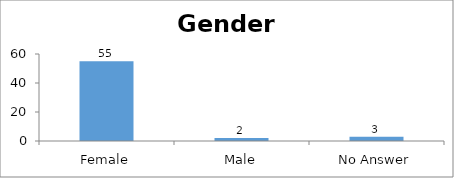
| Category | Gender |
|---|---|
| Female | 55 |
| Male | 2 |
| No Answer | 3 |